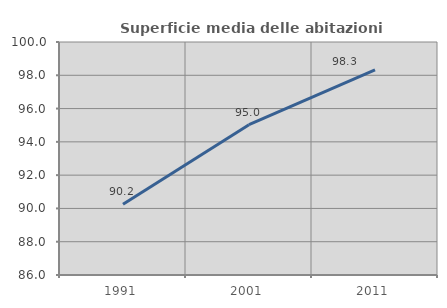
| Category | Superficie media delle abitazioni occupate |
|---|---|
| 1991.0 | 90.245 |
| 2001.0 | 95.029 |
| 2011.0 | 98.322 |